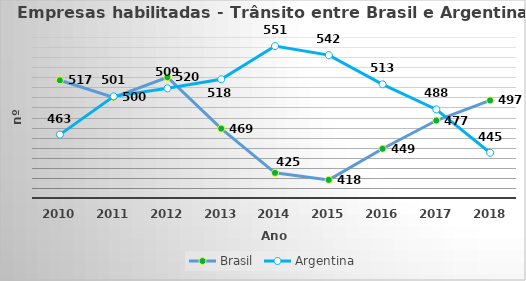
| Category | Brasil | Argentina |
|---|---|---|
| 2010.0 | 517 | 463 |
| 2011.0 | 500 | 501 |
| 2012.0 | 520 | 509 |
| 2013.0 | 469 | 518 |
| 2014.0 | 425 | 551 |
| 2015.0 | 418 | 542 |
| 2016.0 | 449 | 513 |
| 2017.0 | 477 | 488 |
| 2018.0 | 497 | 445 |